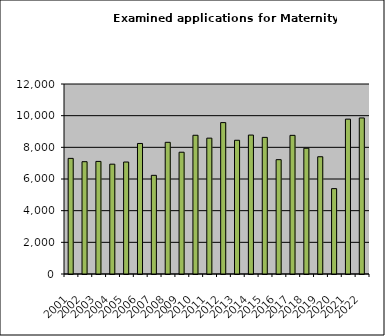
| Category | Series 0 |
|---|---|
| 2001.0 | 7302 |
| 2002.0 | 7093 |
| 2003.0 | 7111 |
| 2004.0 | 6936 |
| 2005.0 | 7072 |
| 2006.0 | 8244 |
| 2007.0 | 6231 |
| 2008.0 | 8317 |
| 2009.0 | 7691 |
| 2010.0 | 8762 |
| 2011.0 | 8580 |
| 2012.0 | 9562 |
| 2013.0 | 8446 |
| 2014.0 | 8775 |
| 2015.0 | 8628 |
| 2016.0 | 7221 |
| 2017.0 | 8757 |
| 2018.0 | 7942 |
| 2019.0 | 7406 |
| 2020.0 | 5392 |
| 2021.0 | 9780 |
| 2022.0 | 9855 |